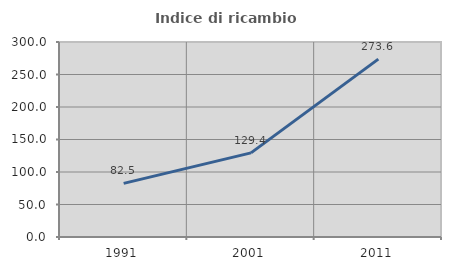
| Category | Indice di ricambio occupazionale  |
|---|---|
| 1991.0 | 82.451 |
| 2001.0 | 129.431 |
| 2011.0 | 273.632 |